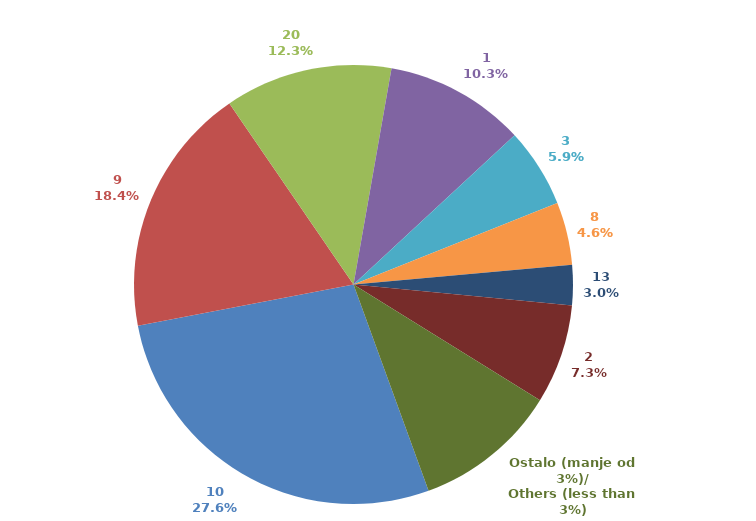
| Category | Series 0 |
|---|---|
| 10 | 0.299 |
| 9 | 0.2 |
| 20 | 0.134 |
| 1 | 0.112 |
| 3 | 0.063 |
| 8 | 0.05 |
| 13 | 0.032 |
| 2 | 0.079 |
| Ostalo (manje od 3%)/
Others (less than 3%) | 0.115 |